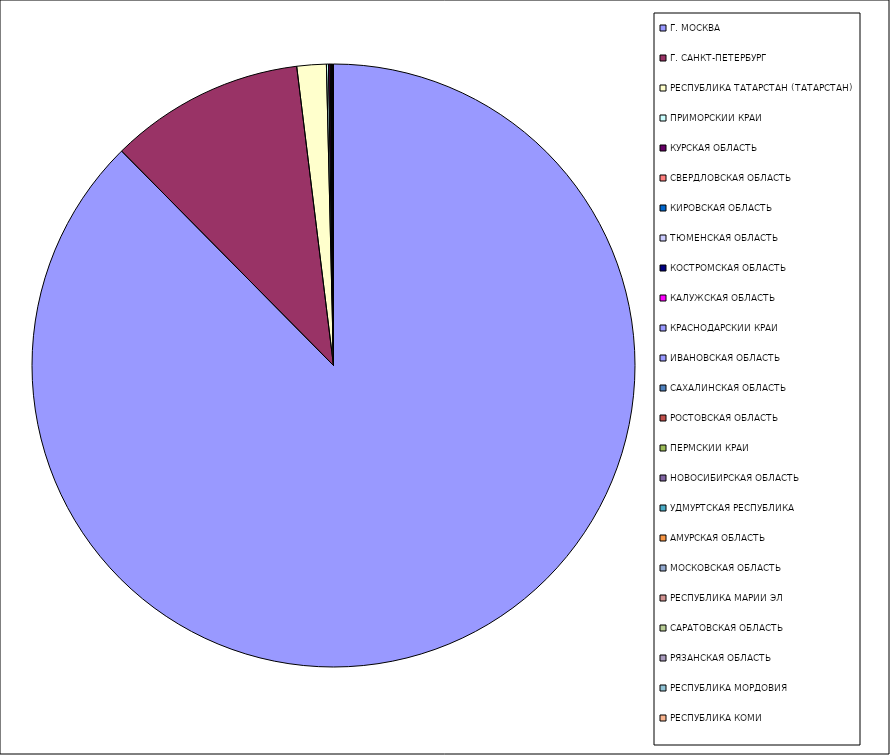
| Category | Оборот |
|---|---|
| Г. МОСКВА | 87.59 |
| Г. САНКТ-ПЕТЕРБУРГ | 10.456 |
| РЕСПУБЛИКА ТАТАРСТАН (ТАТАРСТАН) | 1.574 |
| ПРИМОРСКИЙ КРАЙ | 0.108 |
| КУРСКАЯ ОБЛАСТЬ | 0.092 |
| СВЕРДЛОВСКАЯ ОБЛАСТЬ | 0.047 |
| КИРОВСКАЯ ОБЛАСТЬ | 0.038 |
| ТЮМЕНСКАЯ ОБЛАСТЬ | 0.017 |
| КОСТРОМСКАЯ ОБЛАСТЬ | 0.015 |
| КАЛУЖСКАЯ ОБЛАСТЬ | 0.013 |
| КРАСНОДАРСКИЙ КРАЙ | 0.011 |
| ИВАНОВСКАЯ ОБЛАСТЬ | 0.008 |
| САХАЛИНСКАЯ ОБЛАСТЬ | 0.006 |
| РОСТОВСКАЯ ОБЛАСТЬ | 0.006 |
| ПЕРМСКИЙ КРАЙ | 0.003 |
| НОВОСИБИРСКАЯ ОБЛАСТЬ | 0.002 |
| УДМУРТСКАЯ РЕСПУБЛИКА | 0.002 |
| АМУРСКАЯ ОБЛАСТЬ | 0.002 |
| МОСКОВСКАЯ ОБЛАСТЬ | 0.001 |
| РЕСПУБЛИКА МАРИЙ ЭЛ | 0.001 |
| САРАТОВСКАЯ ОБЛАСТЬ | 0.001 |
| РЯЗАНСКАЯ ОБЛАСТЬ | 0.001 |
| РЕСПУБЛИКА МОРДОВИЯ | 0.001 |
| РЕСПУБЛИКА КОМИ | 0.001 |